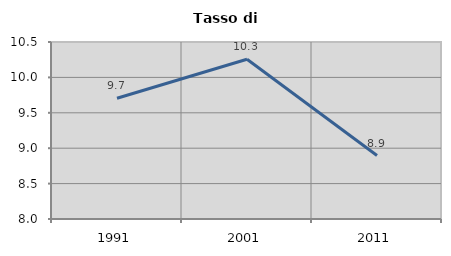
| Category | Tasso di disoccupazione   |
|---|---|
| 1991.0 | 9.705 |
| 2001.0 | 10.256 |
| 2011.0 | 8.897 |